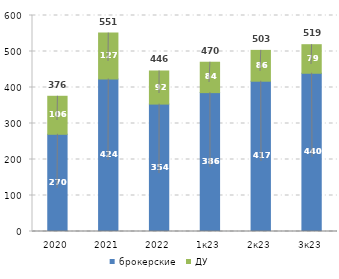
| Category | брокерские | ДУ |
|---|---|---|
| 2020 | 270.015 | 105.606 |
| 2021 | 423.739 | 127.35 |
| 2022 | 353.897 | 91.953 |
| 1к23 | 385.764 | 84.396 |
| 2к23 | 417.483 | 85.596 |
| 3к23 | 439.559 | 79.359 |